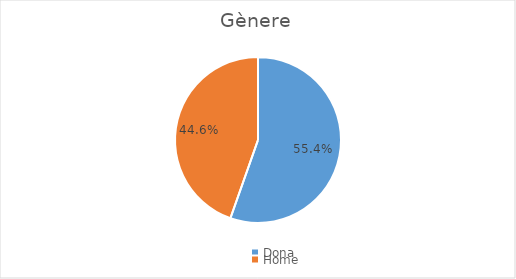
| Category | Series 0 |
|---|---|
| Dona | 0.554 |
| Home | 0.446 |